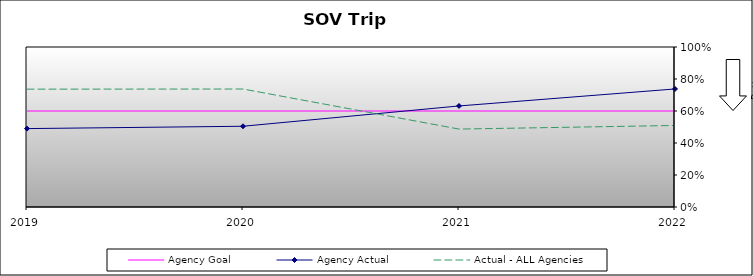
| Category | Agency Goal | Agency Actual | Actual - ALL Agencies |
|---|---|---|---|
| 2019.0 | 0.6 | 0.49 | 0.736 |
| 2020.0 | 0.6 | 0.505 | 0.737 |
| 2021.0 | 0.6 | 0.632 | 0.487 |
| 2022.0 | 0.6 | 0.738 | 0.509 |